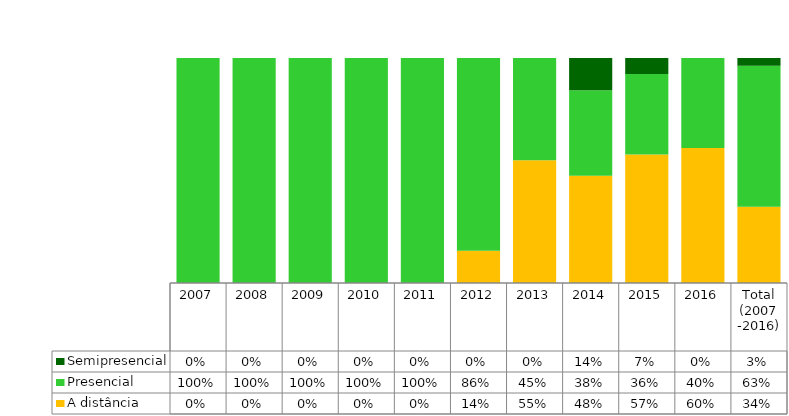
| Category | A distância | Presencial | Semipresencial |
|---|---|---|---|
| 2007 | 0 | 1 | 0 |
| 2008 | 0 | 1 | 0 |
| 2009 | 0 | 1 | 0 |
| 2010 | 0 | 1 | 0 |
| 2011 | 0 | 1 | 0 |
| 2012 | 0.143 | 0.857 | 0 |
| 2013 | 0.545 | 0.455 | 0 |
| 2014 | 0.476 | 0.381 | 0.143 |
| 2015 | 0.571 | 0.357 | 0.071 |
| 2016 | 0.6 | 0.4 | 0 |
| Total (2007 -2016) | 0.339 | 0.627 | 0.034 |